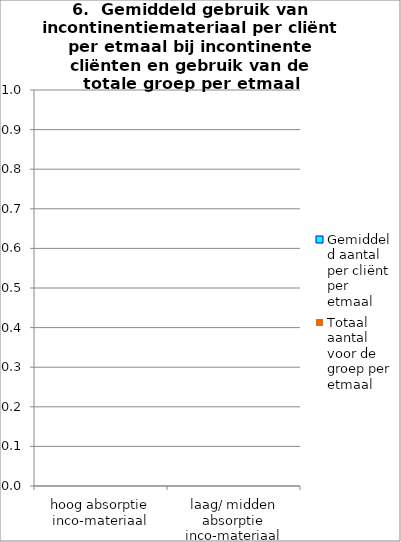
| Category | Gemiddeld aantal per cliënt per etmaal | Totaal aantal voor de groep per etmaal |
|---|---|---|
| hoog absorptie inco-materiaal | 0 | 0 |
| laag/ midden absorptie inco-materiaal | 0 | 0 |